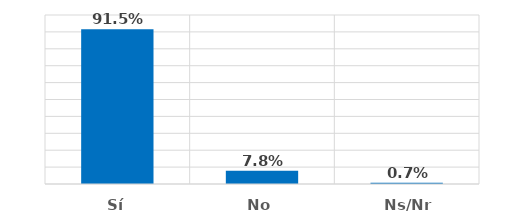
| Category | Series 0 |
|---|---|
| Sí | 0.915 |
| No | 0.078 |
| Ns/Nr | 0.007 |